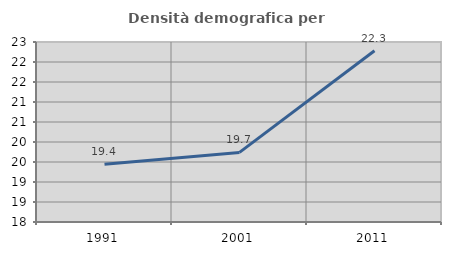
| Category | Densità demografica |
|---|---|
| 1991.0 | 19.447 |
| 2001.0 | 19.74 |
| 2011.0 | 22.281 |